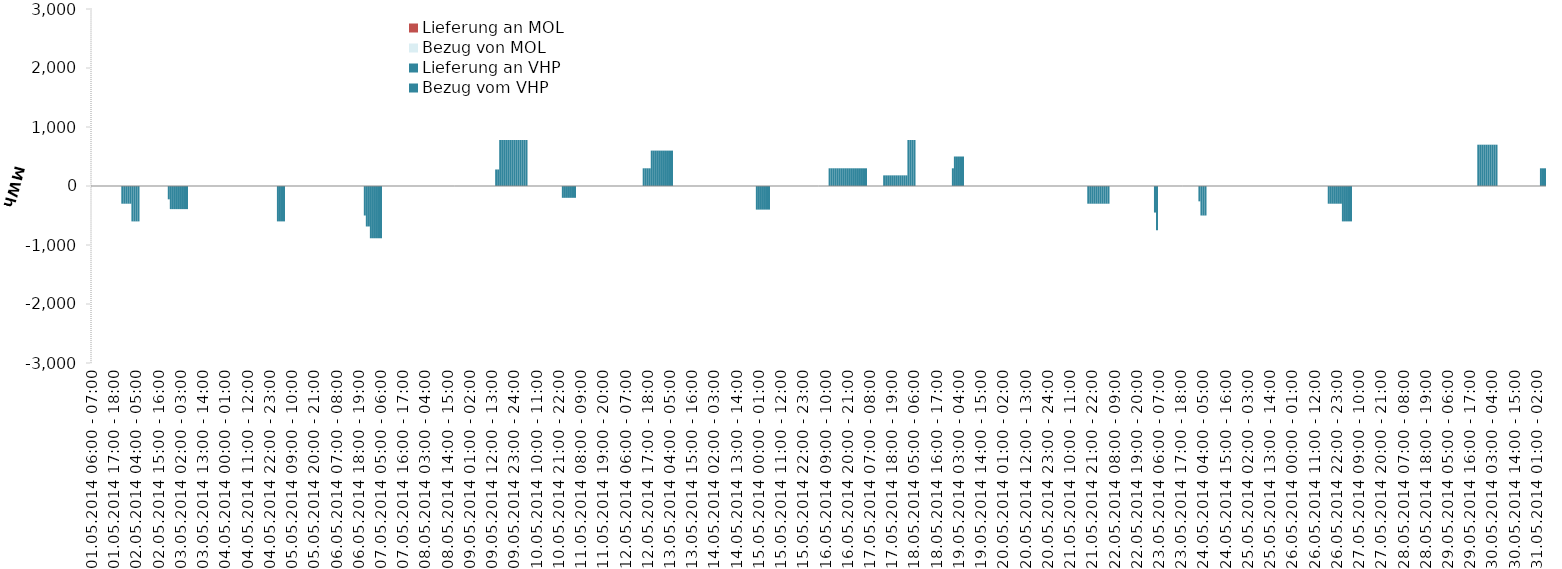
| Category | Bezug vom VHP | Lieferung an VHP | Bezug von MOL | Lieferung an MOL |
|---|---|---|---|---|
| 01.05.2014 06:00 - 07:00 | 0 | 0 | 0 | 0 |
| 01.05.2014 07:00 - 08:00 | 0 | 0 | 0 | 0 |
| 01.05.2014 08:00 - 09:00 | 0 | 0 | 0 | 0 |
| 01.05.2014 09:00 - 10:00 | 0 | 0 | 0 | 0 |
| 01.05.2014 10:00 - 11:00 | 0 | 0 | 0 | 0 |
| 01.05.2014 11:00 - 12:00 | 0 | 0 | 0 | 0 |
| 01.05.2014 12:00 - 13:00 | 0 | 0 | 0 | 0 |
| 01.05.2014 13:00 - 14:00 | 0 | 0 | 0 | 0 |
| 01.05.2014 14:00 - 15:00 | 0 | 0 | 0 | 0 |
| 01.05.2014 15:00 - 16:00 | 0 | 0 | 0 | 0 |
| 01.05.2014 16:00 - 17:00 | 0 | 0 | 0 | 0 |
| 01.05.2014 17:00 - 18:00 | 0 | 0 | 0 | 0 |
| 01.05.2014 18:00 - 19:00 | 0 | 0 | 0 | 0 |
| 01.05.2014 19:00 - 20:00 | 0 | 0 | 0 | 0 |
| 01.05.2014 20:00 - 21:00 | 0 | 0 | 0 | 0 |
| 01.05.2014 21:00 - 22:00 | 0 | -300 | 0 | 0 |
| 01.05.2014 22:00 - 23:00 | 0 | -300 | 0 | 0 |
| 01.05.2014 23:00 - 24:00 | 0 | -300 | 0 | 0 |
| 02.05.2014 00:00 - 01:00 | 0 | -300 | 0 | 0 |
| 02.05.2014 01:00 - 02:00 | 0 | -300 | 0 | 0 |
| 02.05.2014 02:00 - 03:00 | 0 | -600 | 0 | 0 |
| 02.05.2014 03:00 - 04:00 | 0 | -600 | 0 | 0 |
| 02.05.2014 04:00 - 05:00 | 0 | -600 | 0 | 0 |
| 02.05.2014 05:00 - 06:00 | 0 | -600 | 0 | 0 |
| 02.05.2014 06:00 - 07:00 | 0 | 0 | 0 | 0 |
| 02.05.2014 07:00 - 08:00 | 0 | 0 | 0 | 0 |
| 02.05.2014 08:00 - 09:00 | 0 | 0 | 0 | 0 |
| 02.05.2014 09:00 - 10:00 | 0 | 0 | 0 | 0 |
| 02.05.2014 10:00 - 11:00 | 0 | 0 | 0 | 0 |
| 02.05.2014 11:00 - 12:00 | 0 | 0 | 0 | 0 |
| 02.05.2014 12:00 - 13:00 | 0 | 0 | 0 | 0 |
| 02.05.2014 13:00 - 14:00 | 0 | 0 | 0 | 0 |
| 02.05.2014 14:00 - 15:00 | 0 | 0 | 0 | 0 |
| 02.05.2014 15:00 - 16:00 | 0 | 0 | 0 | 0 |
| 02.05.2014 16:00 - 17:00 | 0 | 0 | 0 | 0 |
| 02.05.2014 17:00 - 18:00 | 0 | 0 | 0 | 0 |
| 02.05.2014 18:00 - 19:00 | 0 | 0 | 0 | 0 |
| 02.05.2014 19:00 - 20:00 | 0 | 0 | 0 | 0 |
| 02.05.2014 20:00 - 21:00 | 0 | -226 | 0 | 0 |
| 02.05.2014 21:00 - 22:00 | 0 | -392 | 0 | 0 |
| 02.05.2014 22:00 - 23:00 | 0 | -392 | 0 | 0 |
| 02.05.2014 23:00 - 24:00 | 0 | -392 | 0 | 0 |
| 03.05.2014 00:00 - 01:00 | 0 | -392 | 0 | 0 |
| 03.05.2014 01:00 - 02:00 | 0 | -392 | 0 | 0 |
| 03.05.2014 02:00 - 03:00 | 0 | -392 | 0 | 0 |
| 03.05.2014 03:00 - 04:00 | 0 | -392 | 0 | 0 |
| 03.05.2014 04:00 - 05:00 | 0 | -392 | 0 | 0 |
| 03.05.2014 05:00 - 06:00 | 0 | -392 | 0 | 0 |
| 03.05.2014 06:00 - 07:00 | 0 | 0 | 0 | 0 |
| 03.05.2014 07:00 - 08:00 | 0 | 0 | 0 | 0 |
| 03.05.2014 08:00 - 09:00 | 0 | 0 | 0 | 0 |
| 03.05.2014 09:00 - 10:00 | 0 | 0 | 0 | 0 |
| 03.05.2014 10:00 - 11:00 | 0 | 0 | 0 | 0 |
| 03.05.2014 11:00 - 12:00 | 0 | 0 | 0 | 0 |
| 03.05.2014 12:00 - 13:00 | 0 | 0 | 0 | 0 |
| 03.05.2014 13:00 - 14:00 | 0 | 0 | 0 | 0 |
| 03.05.2014 14:00 - 15:00 | 0 | 0 | 0 | 0 |
| 03.05.2014 15:00 - 16:00 | 0 | 0 | 0 | 0 |
| 03.05.2014 16:00 - 17:00 | 0 | 0 | 0 | 0 |
| 03.05.2014 17:00 - 18:00 | 0 | 0 | 0 | 0 |
| 03.05.2014 18:00 - 19:00 | 0 | 0 | 0 | 0 |
| 03.05.2014 19:00 - 20:00 | 0 | 0 | 0 | 0 |
| 03.05.2014 20:00 - 21:00 | 0 | 0 | 0 | 0 |
| 03.05.2014 21:00 - 22:00 | 0 | 0 | 0 | 0 |
| 03.05.2014 22:00 - 23:00 | 0 | 0 | 0 | 0 |
| 03.05.2014 23:00 - 24:00 | 0 | 0 | 0 | 0 |
| 04.05.2014 00:00 - 01:00 | 0 | 0 | 0 | 0 |
| 04.05.2014 01:00 - 02:00 | 0 | 0 | 0 | 0 |
| 04.05.2014 02:00 - 03:00 | 0 | 0 | 0 | 0 |
| 04.05.2014 03:00 - 04:00 | 0 | 0 | 0 | 0 |
| 04.05.2014 04:00 - 05:00 | 0 | 0 | 0 | 0 |
| 04.05.2014 05:00 - 06:00 | 0 | 0 | 0 | 0 |
| 04.05.2014 06:00 - 07:00 | 0 | 0 | 0 | 0 |
| 04.05.2014 07:00 - 08:00 | 0 | 0 | 0 | 0 |
| 04.05.2014 08:00 - 09:00 | 0 | 0 | 0 | 0 |
| 04.05.2014 09:00 - 10:00 | 0 | 0 | 0 | 0 |
| 04.05.2014 10:00 - 11:00 | 0 | 0 | 0 | 0 |
| 04.05.2014 11:00 - 12:00 | 0 | 0 | 0 | 0 |
| 04.05.2014 12:00 - 13:00 | 0 | 0 | 0 | 0 |
| 04.05.2014 13:00 - 14:00 | 0 | 0 | 0 | 0 |
| 04.05.2014 14:00 - 15:00 | 0 | 0 | 0 | 0 |
| 04.05.2014 15:00 - 16:00 | 0 | 0 | 0 | 0 |
| 04.05.2014 16:00 - 17:00 | 0 | 0 | 0 | 0 |
| 04.05.2014 17:00 - 18:00 | 0 | 0 | 0 | 0 |
| 04.05.2014 18:00 - 19:00 | 0 | 0 | 0 | 0 |
| 04.05.2014 19:00 - 20:00 | 0 | 0 | 0 | 0 |
| 04.05.2014 20:00 - 21:00 | 0 | 0 | 0 | 0 |
| 04.05.2014 21:00 - 22:00 | 0 | 0 | 0 | 0 |
| 04.05.2014 22:00 - 23:00 | 0 | 0 | 0 | 0 |
| 04.05.2014 23:00 - 24:00 | 0 | 0 | 0 | 0 |
| 05.05.2014 00:00 - 01:00 | 0 | 0 | 0 | 0 |
| 05.05.2014 01:00 - 02:00 | 0 | 0 | 0 | 0 |
| 05.05.2014 02:00 - 03:00 | 0 | -600 | 0 | 0 |
| 05.05.2014 03:00 - 04:00 | 0 | -600 | 0 | 0 |
| 05.05.2014 04:00 - 05:00 | 0 | -600 | 0 | 0 |
| 05.05.2014 05:00 - 06:00 | 0 | -600 | 0 | 0 |
| 05.05.2014 06:00 - 07:00 | 0 | 0 | 0 | 0 |
| 05.05.2014 07:00 - 08:00 | 0 | 0 | 0 | 0 |
| 05.05.2014 08:00 - 09:00 | 0 | 0 | 0 | 0 |
| 05.05.2014 09:00 - 10:00 | 0 | 0 | 0 | 0 |
| 05.05.2014 10:00 - 11:00 | 0 | 0 | 0 | 0 |
| 05.05.2014 11:00 - 12:00 | 0 | 0 | 0 | 0 |
| 05.05.2014 12:00 - 13:00 | 0 | 0 | 0 | 0 |
| 05.05.2014 13:00 - 14:00 | 0 | 0 | 0 | 0 |
| 05.05.2014 14:00 - 15:00 | 0 | 0 | 0 | 0 |
| 05.05.2014 15:00 - 16:00 | 0 | 0 | 0 | 0 |
| 05.05.2014 16:00 - 17:00 | 0 | 0 | 0 | 0 |
| 05.05.2014 17:00 - 18:00 | 0 | 0 | 0 | 0 |
| 05.05.2014 18:00 - 19:00 | 0 | 0 | 0 | 0 |
| 05.05.2014 19:00 - 20:00 | 0 | 0 | 0 | 0 |
| 05.05.2014 20:00 - 21:00 | 0 | 0 | 0 | 0 |
| 05.05.2014 21:00 - 22:00 | 0 | 0 | 0 | 0 |
| 05.05.2014 22:00 - 23:00 | 0 | 0 | 0 | 0 |
| 05.05.2014 23:00 - 24:00 | 0 | 0 | 0 | 0 |
| 06.05.2014 00:00 - 01:00 | 0 | 0 | 0 | 0 |
| 06.05.2014 01:00 - 02:00 | 0 | 0 | 0 | 0 |
| 06.05.2014 02:00 - 03:00 | 0 | 0 | 0 | 0 |
| 06.05.2014 03:00 - 04:00 | 0 | 0 | 0 | 0 |
| 06.05.2014 04:00 - 05:00 | 0 | 0 | 0 | 0 |
| 06.05.2014 05:00 - 06:00 | 0 | 0 | 0 | 0 |
| 06.05.2014 06:00 - 07:00 | 0 | 0 | 0 | 0 |
| 06.05.2014 07:00 - 08:00 | 0 | 0 | 0 | 0 |
| 06.05.2014 08:00 - 09:00 | 0 | 0 | 0 | 0 |
| 06.05.2014 09:00 - 10:00 | 0 | 0 | 0 | 0 |
| 06.05.2014 10:00 - 11:00 | 0 | 0 | 0 | 0 |
| 06.05.2014 11:00 - 12:00 | 0 | 0 | 0 | 0 |
| 06.05.2014 12:00 - 13:00 | 0 | 0 | 0 | 0 |
| 06.05.2014 13:00 - 14:00 | 0 | 0 | 0 | 0 |
| 06.05.2014 14:00 - 15:00 | 0 | 0 | 0 | 0 |
| 06.05.2014 15:00 - 16:00 | 0 | 0 | 0 | 0 |
| 06.05.2014 16:00 - 17:00 | 0 | 0 | 0 | 0 |
| 06.05.2014 17:00 - 18:00 | 0 | 0 | 0 | 0 |
| 06.05.2014 18:00 - 19:00 | 0 | 0 | 0 | 0 |
| 06.05.2014 19:00 - 20:00 | 0 | 0 | 0 | 0 |
| 06.05.2014 20:00 - 21:00 | 0 | 0 | 0 | 0 |
| 06.05.2014 21:00 - 22:00 | 0 | -500 | 0 | 0 |
| 06.05.2014 22:00 - 23:00 | 0 | -686 | 0 | 0 |
| 06.05.2014 23:00 - 24:00 | 0 | -686 | 0 | 0 |
| 07.05.2014 00:00 - 01:00 | 0 | -886 | 0 | 0 |
| 07.05.2014 01:00 - 02:00 | 0 | -886 | 0 | 0 |
| 07.05.2014 02:00 - 03:00 | 0 | -886 | 0 | 0 |
| 07.05.2014 03:00 - 04:00 | 0 | -886 | 0 | 0 |
| 07.05.2014 04:00 - 05:00 | 0 | -886 | 0 | 0 |
| 07.05.2014 05:00 - 06:00 | 0 | -886 | 0 | 0 |
| 07.05.2014 06:00 - 07:00 | 0 | 0 | 0 | 0 |
| 07.05.2014 07:00 - 08:00 | 0 | 0 | 0 | 0 |
| 07.05.2014 08:00 - 09:00 | 0 | 0 | 0 | 0 |
| 07.05.2014 09:00 - 10:00 | 0 | 0 | 0 | 0 |
| 07.05.2014 10:00 - 11:00 | 0 | 0 | 0 | 0 |
| 07.05.2014 11:00 - 12:00 | 0 | 0 | 0 | 0 |
| 07.05.2014 12:00 - 13:00 | 0 | 0 | 0 | 0 |
| 07.05.2014 13:00 - 14:00 | 0 | 0 | 0 | 0 |
| 07.05.2014 14:00 - 15:00 | 0 | 0 | 0 | 0 |
| 07.05.2014 15:00 - 16:00 | 0 | 0 | 0 | 0 |
| 07.05.2014 16:00 - 17:00 | 0 | 0 | 0 | 0 |
| 07.05.2014 17:00 - 18:00 | 0 | 0 | 0 | 0 |
| 07.05.2014 18:00 - 19:00 | 0 | 0 | 0 | 0 |
| 07.05.2014 19:00 - 20:00 | 0 | 0 | 0 | 0 |
| 07.05.2014 20:00 - 21:00 | 0 | 0 | 0 | 0 |
| 07.05.2014 21:00 - 22:00 | 0 | 0 | 0 | 0 |
| 07.05.2014 22:00 - 23:00 | 0 | 0 | 0 | 0 |
| 07.05.2014 23:00 - 24:00 | 0 | 0 | 0 | 0 |
| 08.05.2014 00:00 - 01:00 | 0 | 0 | 0 | 0 |
| 08.05.2014 01:00 - 02:00 | 0 | 0 | 0 | 0 |
| 08.05.2014 02:00 - 03:00 | 0 | 0 | 0 | 0 |
| 08.05.2014 03:00 - 04:00 | 0 | 0 | 0 | 0 |
| 08.05.2014 04:00 - 05:00 | 0 | 0 | 0 | 0 |
| 08.05.2014 05:00 - 06:00 | 0 | 0 | 0 | 0 |
| 08.05.2014 06:00 - 07:00 | 0 | 0 | 0 | 0 |
| 08.05.2014 07:00 - 08:00 | 0 | 0 | 0 | 0 |
| 08.05.2014 08:00 - 09:00 | 0 | 0 | 0 | 0 |
| 08.05.2014 09:00 - 10:00 | 0 | 0 | 0 | 0 |
| 08.05.2014 10:00 - 11:00 | 0 | 0 | 0 | 0 |
| 08.05.2014 11:00 - 12:00 | 0 | 0 | 0 | 0 |
| 08.05.2014 12:00 - 13:00 | 0 | 0 | 0 | 0 |
| 08.05.2014 13:00 - 14:00 | 0 | 0 | 0 | 0 |
| 08.05.2014 14:00 - 15:00 | 0 | 0 | 0 | 0 |
| 08.05.2014 15:00 - 16:00 | 0 | 0 | 0 | 0 |
| 08.05.2014 16:00 - 17:00 | 0 | 0 | 0 | 0 |
| 08.05.2014 17:00 - 18:00 | 0 | 0 | 0 | 0 |
| 08.05.2014 18:00 - 19:00 | 0 | 0 | 0 | 0 |
| 08.05.2014 19:00 - 20:00 | 0 | 0 | 0 | 0 |
| 08.05.2014 20:00 - 21:00 | 0 | 0 | 0 | 0 |
| 08.05.2014 21:00 - 22:00 | 0 | 0 | 0 | 0 |
| 08.05.2014 22:00 - 23:00 | 0 | 0 | 0 | 0 |
| 08.05.2014 23:00 - 24:00 | 0 | 0 | 0 | 0 |
| 09.05.2014 00:00 - 01:00 | 0 | 0 | 0 | 0 |
| 09.05.2014 01:00 - 02:00 | 0 | 0 | 0 | 0 |
| 09.05.2014 02:00 - 03:00 | 0 | 0 | 0 | 0 |
| 09.05.2014 03:00 - 04:00 | 0 | 0 | 0 | 0 |
| 09.05.2014 04:00 - 05:00 | 0 | 0 | 0 | 0 |
| 09.05.2014 05:00 - 06:00 | 0 | 0 | 0 | 0 |
| 09.05.2014 06:00 - 07:00 | 0 | 0 | 0 | 0 |
| 09.05.2014 07:00 - 08:00 | 0 | 0 | 0 | 0 |
| 09.05.2014 08:00 - 09:00 | 0 | 0 | 0 | 0 |
| 09.05.2014 09:00 - 10:00 | 0 | 0 | 0 | 0 |
| 09.05.2014 10:00 - 11:00 | 0 | 0 | 0 | 0 |
| 09.05.2014 11:00 - 12:00 | 0 | 0 | 0 | 0 |
| 09.05.2014 12:00 - 13:00 | 0 | 0 | 0 | 0 |
| 09.05.2014 13:00 - 14:00 | 0 | 0 | 0 | 0 |
| 09.05.2014 14:00 - 15:00 | 280 | 0 | 0 | 0 |
| 09.05.2014 15:00 - 16:00 | 280 | 0 | 0 | 0 |
| 09.05.2014 16:00 - 17:00 | 780 | 0 | 0 | 0 |
| 09.05.2014 17:00 - 18:00 | 780 | 0 | 0 | 0 |
| 09.05.2014 18:00 - 19:00 | 780 | 0 | 0 | 0 |
| 09.05.2014 19:00 - 20:00 | 780 | 0 | 0 | 0 |
| 09.05.2014 20:00 - 21:00 | 780 | 0 | 0 | 0 |
| 09.05.2014 21:00 - 22:00 | 780 | 0 | 0 | 0 |
| 09.05.2014 22:00 - 23:00 | 780 | 0 | 0 | 0 |
| 09.05.2014 23:00 - 24:00 | 780 | 0 | 0 | 0 |
| 10.05.2014 00:00 - 01:00 | 780 | 0 | 0 | 0 |
| 10.05.2014 01:00 - 02:00 | 780 | 0 | 0 | 0 |
| 10.05.2014 02:00 - 03:00 | 780 | 0 | 0 | 0 |
| 10.05.2014 03:00 - 04:00 | 780 | 0 | 0 | 0 |
| 10.05.2014 04:00 - 05:00 | 780 | 0 | 0 | 0 |
| 10.05.2014 05:00 - 06:00 | 780 | 0 | 0 | 0 |
| 10.05.2014 06:00 - 07:00 | 0 | 0 | 0 | 0 |
| 10.05.2014 07:00 - 08:00 | 0 | 0 | 0 | 0 |
| 10.05.2014 08:00 - 09:00 | 0 | 0 | 0 | 0 |
| 10.05.2014 09:00 - 10:00 | 0 | 0 | 0 | 0 |
| 10.05.2014 10:00 - 11:00 | 0 | 0 | 0 | 0 |
| 10.05.2014 11:00 - 12:00 | 0 | 0 | 0 | 0 |
| 10.05.2014 12:00 - 13:00 | 0 | 0 | 0 | 0 |
| 10.05.2014 13:00 - 14:00 | 0 | 0 | 0 | 0 |
| 10.05.2014 14:00 - 15:00 | 0 | 0 | 0 | 0 |
| 10.05.2014 15:00 - 16:00 | 0 | 0 | 0 | 0 |
| 10.05.2014 16:00 - 17:00 | 0 | 0 | 0 | 0 |
| 10.05.2014 17:00 - 18:00 | 0 | 0 | 0 | 0 |
| 10.05.2014 18:00 - 19:00 | 0 | 0 | 0 | 0 |
| 10.05.2014 19:00 - 20:00 | 0 | 0 | 0 | 0 |
| 10.05.2014 20:00 - 21:00 | 0 | 0 | 0 | 0 |
| 10.05.2014 21:00 - 22:00 | 0 | 0 | 0 | 0 |
| 10.05.2014 22:00 - 23:00 | 0 | 0 | 0 | 0 |
| 10.05.2014 23:00 - 24:00 | 0 | -200 | 0 | 0 |
| 11.05.2014 00:00 - 01:00 | 0 | -200 | 0 | 0 |
| 11.05.2014 01:00 - 02:00 | 0 | -200 | 0 | 0 |
| 11.05.2014 02:00 - 03:00 | 0 | -200 | 0 | 0 |
| 11.05.2014 03:00 - 04:00 | 0 | -200 | 0 | 0 |
| 11.05.2014 04:00 - 05:00 | 0 | -200 | 0 | 0 |
| 11.05.2014 05:00 - 06:00 | 0 | -200 | 0 | 0 |
| 11.05.2014 06:00 - 07:00 | 0 | 0 | 0 | 0 |
| 11.05.2014 07:00 - 08:00 | 0 | 0 | 0 | 0 |
| 11.05.2014 08:00 - 09:00 | 0 | 0 | 0 | 0 |
| 11.05.2014 09:00 - 10:00 | 0 | 0 | 0 | 0 |
| 11.05.2014 10:00 - 11:00 | 0 | 0 | 0 | 0 |
| 11.05.2014 11:00 - 12:00 | 0 | 0 | 0 | 0 |
| 11.05.2014 12:00 - 13:00 | 0 | 0 | 0 | 0 |
| 11.05.2014 13:00 - 14:00 | 0 | 0 | 0 | 0 |
| 11.05.2014 14:00 - 15:00 | 0 | 0 | 0 | 0 |
| 11.05.2014 15:00 - 16:00 | 0 | 0 | 0 | 0 |
| 11.05.2014 16:00 - 17:00 | 0 | 0 | 0 | 0 |
| 11.05.2014 17:00 - 18:00 | 0 | 0 | 0 | 0 |
| 11.05.2014 18:00 - 19:00 | 0 | 0 | 0 | 0 |
| 11.05.2014 19:00 - 20:00 | 0 | 0 | 0 | 0 |
| 11.05.2014 20:00 - 21:00 | 0 | 0 | 0 | 0 |
| 11.05.2014 21:00 - 22:00 | 0 | 0 | 0 | 0 |
| 11.05.2014 22:00 - 23:00 | 0 | 0 | 0 | 0 |
| 11.05.2014 23:00 - 24:00 | 0 | 0 | 0 | 0 |
| 12.05.2014 00:00 - 01:00 | 0 | 0 | 0 | 0 |
| 12.05.2014 01:00 - 02:00 | 0 | 0 | 0 | 0 |
| 12.05.2014 02:00 - 03:00 | 0 | 0 | 0 | 0 |
| 12.05.2014 03:00 - 04:00 | 0 | 0 | 0 | 0 |
| 12.05.2014 04:00 - 05:00 | 0 | 0 | 0 | 0 |
| 12.05.2014 05:00 - 06:00 | 0 | 0 | 0 | 0 |
| 12.05.2014 06:00 - 07:00 | 0 | 0 | 0 | 0 |
| 12.05.2014 07:00 - 08:00 | 0 | 0 | 0 | 0 |
| 12.05.2014 08:00 - 09:00 | 0 | 0 | 0 | 0 |
| 12.05.2014 09:00 - 10:00 | 0 | 0 | 0 | 0 |
| 12.05.2014 10:00 - 11:00 | 0 | 0 | 0 | 0 |
| 12.05.2014 11:00 - 12:00 | 0 | 0 | 0 | 0 |
| 12.05.2014 12:00 - 13:00 | 0 | 0 | 0 | 0 |
| 12.05.2014 13:00 - 14:00 | 0 | 0 | 0 | 0 |
| 12.05.2014 14:00 - 15:00 | 0 | 0 | 0 | 0 |
| 12.05.2014 15:00 - 16:00 | 300 | 0 | 0 | 0 |
| 12.05.2014 16:00 - 17:00 | 300 | 0 | 0 | 0 |
| 12.05.2014 17:00 - 18:00 | 300 | 0 | 0 | 0 |
| 12.05.2014 18:00 - 19:00 | 300 | 0 | 0 | 0 |
| 12.05.2014 19:00 - 20:00 | 600 | 0 | 0 | 0 |
| 12.05.2014 20:00 - 21:00 | 600 | 0 | 0 | 0 |
| 12.05.2014 21:00 - 22:00 | 600 | 0 | 0 | 0 |
| 12.05.2014 22:00 - 23:00 | 600 | 0 | 0 | 0 |
| 12.05.2014 23:00 - 24:00 | 600 | 0 | 0 | 0 |
| 13.05.2014 00:00 - 01:00 | 600 | 0 | 0 | 0 |
| 13.05.2014 01:00 - 02:00 | 600 | 0 | 0 | 0 |
| 13.05.2014 02:00 - 03:00 | 600 | 0 | 0 | 0 |
| 13.05.2014 03:00 - 04:00 | 600 | 0 | 0 | 0 |
| 13.05.2014 04:00 - 05:00 | 600 | 0 | 0 | 0 |
| 13.05.2014 05:00 - 06:00 | 600 | 0 | 0 | 0 |
| 13.05.2014 06:00 - 07:00 | 0 | 0 | 0 | 0 |
| 13.05.2014 07:00 - 08:00 | 0 | 0 | 0 | 0 |
| 13.05.2014 08:00 - 09:00 | 0 | 0 | 0 | 0 |
| 13.05.2014 09:00 - 10:00 | 0 | 0 | 0 | 0 |
| 13.05.2014 10:00 - 11:00 | 0 | 0 | 0 | 0 |
| 13.05.2014 11:00 - 12:00 | 0 | 0 | 0 | 0 |
| 13.05.2014 12:00 - 13:00 | 0 | 0 | 0 | 0 |
| 13.05.2014 13:00 - 14:00 | 0 | 0 | 0 | 0 |
| 13.05.2014 14:00 - 15:00 | 0 | 0 | 0 | 0 |
| 13.05.2014 15:00 - 16:00 | 0 | 0 | 0 | 0 |
| 13.05.2014 16:00 - 17:00 | 0 | 0 | 0 | 0 |
| 13.05.2014 17:00 - 18:00 | 0 | 0 | 0 | 0 |
| 13.05.2014 18:00 - 19:00 | 0 | 0 | 0 | 0 |
| 13.05.2014 19:00 - 20:00 | 0 | 0 | 0 | 0 |
| 13.05.2014 20:00 - 21:00 | 0 | 0 | 0 | 0 |
| 13.05.2014 21:00 - 22:00 | 0 | 0 | 0 | 0 |
| 13.05.2014 22:00 - 23:00 | 0 | 0 | 0 | 0 |
| 13.05.2014 23:00 - 24:00 | 0 | 0 | 0 | 0 |
| 14.05.2014 00:00 - 01:00 | 0 | 0 | 0 | 0 |
| 14.05.2014 01:00 - 02:00 | 0 | 0 | 0 | 0 |
| 14.05.2014 02:00 - 03:00 | 0 | 0 | 0 | 0 |
| 14.05.2014 03:00 - 04:00 | 0 | 0 | 0 | 0 |
| 14.05.2014 04:00 - 05:00 | 0 | 0 | 0 | 0 |
| 14.05.2014 05:00 - 06:00 | 0 | 0 | 0 | 0 |
| 14.05.2014 06:00 - 07:00 | 0 | 0 | 0 | 0 |
| 14.05.2014 07:00 - 08:00 | 0 | 0 | 0 | 0 |
| 14.05.2014 08:00 - 09:00 | 0 | 0 | 0 | 0 |
| 14.05.2014 09:00 - 10:00 | 0 | 0 | 0 | 0 |
| 14.05.2014 10:00 - 11:00 | 0 | 0 | 0 | 0 |
| 14.05.2014 11:00 - 12:00 | 0 | 0 | 0 | 0 |
| 14.05.2014 12:00 - 13:00 | 0 | 0 | 0 | 0 |
| 14.05.2014 13:00 - 14:00 | 0 | 0 | 0 | 0 |
| 14.05.2014 14:00 - 15:00 | 0 | 0 | 0 | 0 |
| 14.05.2014 15:00 - 16:00 | 0 | 0 | 0 | 0 |
| 14.05.2014 16:00 - 17:00 | 0 | 0 | 0 | 0 |
| 14.05.2014 17:00 - 18:00 | 0 | 0 | 0 | 0 |
| 14.05.2014 18:00 - 19:00 | 0 | 0 | 0 | 0 |
| 14.05.2014 19:00 - 20:00 | 0 | 0 | 0 | 0 |
| 14.05.2014 20:00 - 21:00 | 0 | 0 | 0 | 0 |
| 14.05.2014 21:00 - 22:00 | 0 | 0 | 0 | 0 |
| 14.05.2014 22:00 - 23:00 | 0 | 0 | 0 | 0 |
| 14.05.2014 23:00 - 24:00 | 0 | -400 | 0 | 0 |
| 15.05.2014 00:00 - 01:00 | 0 | -400 | 0 | 0 |
| 15.05.2014 01:00 - 02:00 | 0 | -400 | 0 | 0 |
| 15.05.2014 02:00 - 03:00 | 0 | -400 | 0 | 0 |
| 15.05.2014 03:00 - 04:00 | 0 | -400 | 0 | 0 |
| 15.05.2014 04:00 - 05:00 | 0 | -400 | 0 | 0 |
| 15.05.2014 05:00 - 06:00 | 0 | -400 | 0 | 0 |
| 15.05.2014 06:00 - 07:00 | 0 | 0 | 0 | 0 |
| 15.05.2014 07:00 - 08:00 | 0 | 0 | 0 | 0 |
| 15.05.2014 08:00 - 09:00 | 0 | 0 | 0 | 0 |
| 15.05.2014 09:00 - 10:00 | 0 | 0 | 0 | 0 |
| 15.05.2014 10:00 - 11:00 | 0 | 0 | 0 | 0 |
| 15.05.2014 11:00 - 12:00 | 0 | 0 | 0 | 0 |
| 15.05.2014 12:00 - 13:00 | 0 | 0 | 0 | 0 |
| 15.05.2014 13:00 - 14:00 | 0 | 0 | 0 | 0 |
| 15.05.2014 14:00 - 15:00 | 0 | 0 | 0 | 0 |
| 15.05.2014 15:00 - 16:00 | 0 | 0 | 0 | 0 |
| 15.05.2014 16:00 - 17:00 | 0 | 0 | 0 | 0 |
| 15.05.2014 17:00 - 18:00 | 0 | 0 | 0 | 0 |
| 15.05.2014 18:00 - 19:00 | 0 | 0 | 0 | 0 |
| 15.05.2014 19:00 - 20:00 | 0 | 0 | 0 | 0 |
| 15.05.2014 20:00 - 21:00 | 0 | 0 | 0 | 0 |
| 15.05.2014 21:00 - 22:00 | 0 | 0 | 0 | 0 |
| 15.05.2014 22:00 - 23:00 | 0 | 0 | 0 | 0 |
| 15.05.2014 23:00 - 24:00 | 0 | 0 | 0 | 0 |
| 16.05.2014 00:00 - 01:00 | 0 | 0 | 0 | 0 |
| 16.05.2014 01:00 - 02:00 | 0 | 0 | 0 | 0 |
| 16.05.2014 02:00 - 03:00 | 0 | 0 | 0 | 0 |
| 16.05.2014 03:00 - 04:00 | 0 | 0 | 0 | 0 |
| 16.05.2014 04:00 - 05:00 | 0 | 0 | 0 | 0 |
| 16.05.2014 05:00 - 06:00 | 0 | 0 | 0 | 0 |
| 16.05.2014 06:00 - 07:00 | 0 | 0 | 0 | 0 |
| 16.05.2014 07:00 - 08:00 | 0 | 0 | 0 | 0 |
| 16.05.2014 08:00 - 09:00 | 0 | 0 | 0 | 0 |
| 16.05.2014 09:00 - 10:00 | 0 | 0 | 0 | 0 |
| 16.05.2014 10:00 - 11:00 | 0 | 0 | 0 | 0 |
| 16.05.2014 11:00 - 12:00 | 300 | 0 | 0 | 0 |
| 16.05.2014 12:00 - 13:00 | 300 | 0 | 0 | 0 |
| 16.05.2014 13:00 - 14:00 | 300 | 0 | 0 | 0 |
| 16.05.2014 14:00 - 15:00 | 300 | 0 | 0 | 0 |
| 16.05.2014 15:00 - 16:00 | 300 | 0 | 0 | 0 |
| 16.05.2014 16:00 - 17:00 | 300 | 0 | 0 | 0 |
| 16.05.2014 17:00 - 18:00 | 300 | 0 | 0 | 0 |
| 16.05.2014 18:00 - 19:00 | 300 | 0 | 0 | 0 |
| 16.05.2014 19:00 - 20:00 | 300 | 0 | 0 | 0 |
| 16.05.2014 20:00 - 21:00 | 300 | 0 | 0 | 0 |
| 16.05.2014 21:00 - 22:00 | 300 | 0 | 0 | 0 |
| 16.05.2014 22:00 - 23:00 | 300 | 0 | 0 | 0 |
| 16.05.2014 23:00 - 24:00 | 300 | 0 | 0 | 0 |
| 17.05.2014 00:00 - 01:00 | 300 | 0 | 0 | 0 |
| 17.05.2014 01:00 - 02:00 | 300 | 0 | 0 | 0 |
| 17.05.2014 02:00 - 03:00 | 300 | 0 | 0 | 0 |
| 17.05.2014 03:00 - 04:00 | 300 | 0 | 0 | 0 |
| 17.05.2014 04:00 - 05:00 | 300 | 0 | 0 | 0 |
| 17.05.2014 05:00 - 06:00 | 300 | 0 | 0 | 0 |
| 17.05.2014 06:00 - 07:00 | 0 | 0 | 0 | 0 |
| 17.05.2014 07:00 - 08:00 | 0 | 0 | 0 | 0 |
| 17.05.2014 08:00 - 09:00 | 0 | 0 | 0 | 0 |
| 17.05.2014 09:00 - 10:00 | 0 | 0 | 0 | 0 |
| 17.05.2014 10:00 - 11:00 | 0 | 0 | 0 | 0 |
| 17.05.2014 11:00 - 12:00 | 0 | 0 | 0 | 0 |
| 17.05.2014 12:00 - 13:00 | 0 | 0 | 0 | 0 |
| 17.05.2014 13:00 - 14:00 | 0 | 0 | 0 | 0 |
| 17.05.2014 14:00 - 15:00 | 180 | 0 | 0 | 0 |
| 17.05.2014 15:00 - 16:00 | 180 | 0 | 0 | 0 |
| 17.05.2014 16:00 - 17:00 | 180 | 0 | 0 | 0 |
| 17.05.2014 17:00 - 18:00 | 180 | 0 | 0 | 0 |
| 17.05.2014 18:00 - 19:00 | 180 | 0 | 0 | 0 |
| 17.05.2014 19:00 - 20:00 | 180 | 0 | 0 | 0 |
| 17.05.2014 20:00 - 21:00 | 180 | 0 | 0 | 0 |
| 17.05.2014 21:00 - 22:00 | 180 | 0 | 0 | 0 |
| 17.05.2014 22:00 - 23:00 | 180 | 0 | 0 | 0 |
| 17.05.2014 23:00 - 24:00 | 180 | 0 | 0 | 0 |
| 18.05.2014 00:00 - 01:00 | 180 | 0 | 0 | 0 |
| 18.05.2014 01:00 - 02:00 | 180 | 0 | 0 | 0 |
| 18.05.2014 02:00 - 03:00 | 780 | 0 | 0 | 0 |
| 18.05.2014 03:00 - 04:00 | 780 | 0 | 0 | 0 |
| 18.05.2014 04:00 - 05:00 | 780 | 0 | 0 | 0 |
| 18.05.2014 05:00 - 06:00 | 780 | 0 | 0 | 0 |
| 18.05.2014 06:00 - 07:00 | 0 | 0 | 0 | 0 |
| 18.05.2014 07:00 - 08:00 | 0 | 0 | 0 | 0 |
| 18.05.2014 08:00 - 09:00 | 0 | 0 | 0 | 0 |
| 18.05.2014 09:00 - 10:00 | 0 | 0 | 0 | 0 |
| 18.05.2014 10:00 - 11:00 | 0 | 0 | 0 | 0 |
| 18.05.2014 11:00 - 12:00 | 0 | 0 | 0 | 0 |
| 18.05.2014 12:00 - 13:00 | 0 | 0 | 0 | 0 |
| 18.05.2014 13:00 - 14:00 | 0 | 0 | 0 | 0 |
| 18.05.2014 14:00 - 15:00 | 0 | 0 | 0 | 0 |
| 18.05.2014 15:00 - 16:00 | 0 | 0 | 0 | 0 |
| 18.05.2014 16:00 - 17:00 | 0 | 0 | 0 | 0 |
| 18.05.2014 17:00 - 18:00 | 0 | 0 | 0 | 0 |
| 18.05.2014 18:00 - 19:00 | 0 | 0 | 0 | 0 |
| 18.05.2014 19:00 - 20:00 | 0 | 0 | 0 | 0 |
| 18.05.2014 20:00 - 21:00 | 0 | 0 | 0 | 0 |
| 18.05.2014 21:00 - 22:00 | 0 | 0 | 0 | 0 |
| 18.05.2014 22:00 - 23:00 | 0 | 0 | 0 | 0 |
| 18.05.2014 23:00 - 24:00 | 0 | 0 | 0 | 0 |
| 19.05.2014 00:00 - 01:00 | 300 | 0 | 0 | 0 |
| 19.05.2014 01:00 - 02:00 | 500 | 0 | 0 | 0 |
| 19.05.2014 02:00 - 03:00 | 500 | 0 | 0 | 0 |
| 19.05.2014 03:00 - 04:00 | 500 | 0 | 0 | 0 |
| 19.05.2014 04:00 - 05:00 | 500 | 0 | 0 | 0 |
| 19.05.2014 05:00 - 06:00 | 500 | 0 | 0 | 0 |
| 19.05.2014 06:00 - 07:00 | 0 | 0 | 0 | 0 |
| 19.05.2014 07:00 - 08:00 | 0 | 0 | 0 | 0 |
| 19.05.2014 08:00 - 09:00 | 0 | 0 | 0 | 0 |
| 19.05.2014 09:00 - 10:00 | 0 | 0 | 0 | 0 |
| 19.05.2014 10:00 - 11:00 | 0 | 0 | 0 | 0 |
| 19.05.2014 11:00 - 12:00 | 0 | 0 | 0 | 0 |
| 19.05.2014 12:00 - 13:00 | 0 | 0 | 0 | 0 |
| 19.05.2014 13:00 - 14:00 | 0 | 0 | 0 | 0 |
| 19.05.2014 14:00 - 15:00 | 0 | 0 | 0 | 0 |
| 19.05.2014 15:00 - 16:00 | 0 | 0 | 0 | 0 |
| 19.05.2014 16:00 - 17:00 | 0 | 0 | 0 | 0 |
| 19.05.2014 17:00 - 18:00 | 0 | 0 | 0 | 0 |
| 19.05.2014 18:00 - 19:00 | 0 | 0 | 0 | 0 |
| 19.05.2014 19:00 - 20:00 | 0 | 0 | 0 | 0 |
| 19.05.2014 20:00 - 21:00 | 0 | 0 | 0 | 0 |
| 19.05.2014 21:00 - 22:00 | 0 | 0 | 0 | 0 |
| 19.05.2014 22:00 - 23:00 | 0 | 0 | 0 | 0 |
| 19.05.2014 23:00 - 24:00 | 0 | 0 | 0 | 0 |
| 20.05.2014 00:00 - 01:00 | 0 | 0 | 0 | 0 |
| 20.05.2014 01:00 - 02:00 | 0 | 0 | 0 | 0 |
| 20.05.2014 02:00 - 03:00 | 0 | 0 | 0 | 0 |
| 20.05.2014 03:00 - 04:00 | 0 | 0 | 0 | 0 |
| 20.05.2014 04:00 - 05:00 | 0 | 0 | 0 | 0 |
| 20.05.2014 05:00 - 06:00 | 0 | 0 | 0 | 0 |
| 20.05.2014 06:00 - 07:00 | 0 | 0 | 0 | 0 |
| 20.05.2014 07:00 - 08:00 | 0 | 0 | 0 | 0 |
| 20.05.2014 08:00 - 09:00 | 0 | 0 | 0 | 0 |
| 20.05.2014 09:00 - 10:00 | 0 | 0 | 0 | 0 |
| 20.05.2014 10:00 - 11:00 | 0 | 0 | 0 | 0 |
| 20.05.2014 11:00 - 12:00 | 0 | 0 | 0 | 0 |
| 20.05.2014 12:00 - 13:00 | 0 | 0 | 0 | 0 |
| 20.05.2014 13:00 - 14:00 | 0 | 0 | 0 | 0 |
| 20.05.2014 14:00 - 15:00 | 0 | 0 | 0 | 0 |
| 20.05.2014 15:00 - 16:00 | 0 | 0 | 0 | 0 |
| 20.05.2014 16:00 - 17:00 | 0 | 0 | 0 | 0 |
| 20.05.2014 17:00 - 18:00 | 0 | 0 | 0 | 0 |
| 20.05.2014 18:00 - 19:00 | 0 | 0 | 0 | 0 |
| 20.05.2014 19:00 - 20:00 | 0 | 0 | 0 | 0 |
| 20.05.2014 20:00 - 21:00 | 0 | 0 | 0 | 0 |
| 20.05.2014 21:00 - 22:00 | 0 | 0 | 0 | 0 |
| 20.05.2014 22:00 - 23:00 | 0 | 0 | 0 | 0 |
| 20.05.2014 23:00 - 24:00 | 0 | 0 | 0 | 0 |
| 21.05.2014 00:00 - 01:00 | 0 | 0 | 0 | 0 |
| 21.05.2014 01:00 - 02:00 | 0 | 0 | 0 | 0 |
| 21.05.2014 02:00 - 03:00 | 0 | 0 | 0 | 0 |
| 21.05.2014 03:00 - 04:00 | 0 | 0 | 0 | 0 |
| 21.05.2014 04:00 - 05:00 | 0 | 0 | 0 | 0 |
| 21.05.2014 05:00 - 06:00 | 0 | 0 | 0 | 0 |
| 21.05.2014 06:00 - 07:00 | 0 | 0 | 0 | 0 |
| 21.05.2014 07:00 - 08:00 | 0 | 0 | 0 | 0 |
| 21.05.2014 08:00 - 09:00 | 0 | 0 | 0 | 0 |
| 21.05.2014 09:00 - 10:00 | 0 | 0 | 0 | 0 |
| 21.05.2014 10:00 - 11:00 | 0 | 0 | 0 | 0 |
| 21.05.2014 11:00 - 12:00 | 0 | 0 | 0 | 0 |
| 21.05.2014 12:00 - 13:00 | 0 | 0 | 0 | 0 |
| 21.05.2014 13:00 - 14:00 | 0 | 0 | 0 | 0 |
| 21.05.2014 14:00 - 15:00 | 0 | 0 | 0 | 0 |
| 21.05.2014 15:00 - 16:00 | 0 | 0 | 0 | 0 |
| 21.05.2014 16:00 - 17:00 | 0 | 0 | 0 | 0 |
| 21.05.2014 17:00 - 18:00 | 0 | 0 | 0 | 0 |
| 21.05.2014 18:00 - 19:00 | 0 | 0 | 0 | 0 |
| 21.05.2014 19:00 - 20:00 | 0 | -300 | 0 | 0 |
| 21.05.2014 20:00 - 21:00 | 0 | -300 | 0 | 0 |
| 21.05.2014 21:00 - 22:00 | 0 | -300 | 0 | 0 |
| 21.05.2014 22:00 - 23:00 | 0 | -300 | 0 | 0 |
| 21.05.2014 23:00 - 24:00 | 0 | -300 | 0 | 0 |
| 22.05.2014 00:00 - 01:00 | 0 | -300 | 0 | 0 |
| 22.05.2014 01:00 - 02:00 | 0 | -300 | 0 | 0 |
| 22.05.2014 02:00 - 03:00 | 0 | -300 | 0 | 0 |
| 22.05.2014 03:00 - 04:00 | 0 | -300 | 0 | 0 |
| 22.05.2014 04:00 - 05:00 | 0 | -300 | 0 | 0 |
| 22.05.2014 05:00 - 06:00 | 0 | -300 | 0 | 0 |
| 22.05.2014 06:00 - 07:00 | 0 | 0 | 0 | 0 |
| 22.05.2014 07:00 - 08:00 | 0 | 0 | 0 | 0 |
| 22.05.2014 08:00 - 09:00 | 0 | 0 | 0 | 0 |
| 22.05.2014 09:00 - 10:00 | 0 | 0 | 0 | 0 |
| 22.05.2014 10:00 - 11:00 | 0 | 0 | 0 | 0 |
| 22.05.2014 11:00 - 12:00 | 0 | 0 | 0 | 0 |
| 22.05.2014 12:00 - 13:00 | 0 | 0 | 0 | 0 |
| 22.05.2014 13:00 - 14:00 | 0 | 0 | 0 | 0 |
| 22.05.2014 14:00 - 15:00 | 0 | 0 | 0 | 0 |
| 22.05.2014 15:00 - 16:00 | 0 | 0 | 0 | 0 |
| 22.05.2014 16:00 - 17:00 | 0 | 0 | 0 | 0 |
| 22.05.2014 17:00 - 18:00 | 0 | 0 | 0 | 0 |
| 22.05.2014 18:00 - 19:00 | 0 | 0 | 0 | 0 |
| 22.05.2014 19:00 - 20:00 | 0 | 0 | 0 | 0 |
| 22.05.2014 20:00 - 21:00 | 0 | 0 | 0 | 0 |
| 22.05.2014 21:00 - 22:00 | 0 | 0 | 0 | 0 |
| 22.05.2014 22:00 - 23:00 | 0 | 0 | 0 | 0 |
| 22.05.2014 23:00 - 24:00 | 0 | 0 | 0 | 0 |
| 23.05.2014 00:00 - 01:00 | 0 | 0 | 0 | 0 |
| 23.05.2014 01:00 - 02:00 | 0 | 0 | 0 | 0 |
| 23.05.2014 02:00 - 03:00 | 0 | 0 | 0 | 0 |
| 23.05.2014 03:00 - 04:00 | 0 | 0 | 0 | 0 |
| 23.05.2014 04:00 - 05:00 | 0 | -450 | 0 | 0 |
| 23.05.2014 05:00 - 06:00 | 0 | -750 | 0 | 0 |
| 23.05.2014 06:00 - 07:00 | 0 | 0 | 0 | 0 |
| 23.05.2014 07:00 - 08:00 | 0 | 0 | 0 | 0 |
| 23.05.2014 08:00 - 09:00 | 0 | 0 | 0 | 0 |
| 23.05.2014 09:00 - 10:00 | 0 | 0 | 0 | 0 |
| 23.05.2014 10:00 - 11:00 | 0 | 0 | 0 | 0 |
| 23.05.2014 11:00 - 12:00 | 0 | 0 | 0 | 0 |
| 23.05.2014 12:00 - 13:00 | 0 | 0 | 0 | 0 |
| 23.05.2014 13:00 - 14:00 | 0 | 0 | 0 | 0 |
| 23.05.2014 14:00 - 15:00 | 0 | 0 | 0 | 0 |
| 23.05.2014 15:00 - 16:00 | 0 | 0 | 0 | 0 |
| 23.05.2014 16:00 - 17:00 | 0 | 0 | 0 | 0 |
| 23.05.2014 17:00 - 18:00 | 0 | 0 | 0 | 0 |
| 23.05.2014 18:00 - 19:00 | 0 | 0 | 0 | 0 |
| 23.05.2014 19:00 - 20:00 | 0 | 0 | 0 | 0 |
| 23.05.2014 20:00 - 21:00 | 0 | 0 | 0 | 0 |
| 23.05.2014 21:00 - 22:00 | 0 | 0 | 0 | 0 |
| 23.05.2014 22:00 - 23:00 | 0 | 0 | 0 | 0 |
| 23.05.2014 23:00 - 24:00 | 0 | 0 | 0 | 0 |
| 24.05.2014 00:00 - 01:00 | 0 | 0 | 0 | 0 |
| 24.05.2014 01:00 - 02:00 | 0 | 0 | 0 | 0 |
| 24.05.2014 02:00 - 03:00 | 0 | -260 | 0 | 0 |
| 24.05.2014 03:00 - 04:00 | 0 | -500 | 0 | 0 |
| 24.05.2014 04:00 - 05:00 | 0 | -500 | 0 | 0 |
| 24.05.2014 05:00 - 06:00 | 0 | -500 | 0 | 0 |
| 24.05.2014 06:00 - 07:00 | 0 | 0 | 0 | 0 |
| 24.05.2014 07:00 - 08:00 | 0 | 0 | 0 | 0 |
| 24.05.2014 08:00 - 09:00 | 0 | 0 | 0 | 0 |
| 24.05.2014 09:00 - 10:00 | 0 | 0 | 0 | 0 |
| 24.05.2014 10:00 - 11:00 | 0 | 0 | 0 | 0 |
| 24.05.2014 11:00 - 12:00 | 0 | 0 | 0 | 0 |
| 24.05.2014 12:00 - 13:00 | 0 | 0 | 0 | 0 |
| 24.05.2014 13:00 - 14:00 | 0 | 0 | 0 | 0 |
| 24.05.2014 14:00 - 15:00 | 0 | 0 | 0 | 0 |
| 24.05.2014 15:00 - 16:00 | 0 | 0 | 0 | 0 |
| 24.05.2014 16:00 - 17:00 | 0 | 0 | 0 | 0 |
| 24.05.2014 17:00 - 18:00 | 0 | 0 | 0 | 0 |
| 24.05.2014 18:00 - 19:00 | 0 | 0 | 0 | 0 |
| 24.05.2014 19:00 - 20:00 | 0 | 0 | 0 | 0 |
| 24.05.2014 20:00 - 21:00 | 0 | 0 | 0 | 0 |
| 24.05.2014 21:00 - 22:00 | 0 | 0 | 0 | 0 |
| 24.05.2014 22:00 - 23:00 | 0 | 0 | 0 | 0 |
| 24.05.2014 23:00 - 24:00 | 0 | 0 | 0 | 0 |
| 25.05.2014 00:00 - 01:00 | 0 | 0 | 0 | 0 |
| 25.05.2014 01:00 - 02:00 | 0 | 0 | 0 | 0 |
| 25.05.2014 02:00 - 03:00 | 0 | 0 | 0 | 0 |
| 25.05.2014 03:00 - 04:00 | 0 | 0 | 0 | 0 |
| 25.05.2014 04:00 - 05:00 | 0 | 0 | 0 | 0 |
| 25.05.2014 05:00 - 06:00 | 0 | 0 | 0 | 0 |
| 25.05.2014 06:00 - 07:00 | 0 | 0 | 0 | 0 |
| 25.05.2014 07:00 - 08:00 | 0 | 0 | 0 | 0 |
| 25.05.2014 08:00 - 09:00 | 0 | 0 | 0 | 0 |
| 25.05.2014 09:00 - 10:00 | 0 | 0 | 0 | 0 |
| 25.05.2014 10:00 - 11:00 | 0 | 0 | 0 | 0 |
| 25.05.2014 11:00 - 12:00 | 0 | 0 | 0 | 0 |
| 25.05.2014 12:00 - 13:00 | 0 | 0 | 0 | 0 |
| 25.05.2014 13:00 - 14:00 | 0 | 0 | 0 | 0 |
| 25.05.2014 14:00 - 15:00 | 0 | 0 | 0 | 0 |
| 25.05.2014 15:00 - 16:00 | 0 | 0 | 0 | 0 |
| 25.05.2014 16:00 - 17:00 | 0 | 0 | 0 | 0 |
| 25.05.2014 17:00 - 18:00 | 0 | 0 | 0 | 0 |
| 25.05.2014 18:00 - 19:00 | 0 | 0 | 0 | 0 |
| 25.05.2014 19:00 - 20:00 | 0 | 0 | 0 | 0 |
| 25.05.2014 20:00 - 21:00 | 0 | 0 | 0 | 0 |
| 25.05.2014 21:00 - 22:00 | 0 | 0 | 0 | 0 |
| 25.05.2014 22:00 - 23:00 | 0 | 0 | 0 | 0 |
| 25.05.2014 23:00 - 24:00 | 0 | 0 | 0 | 0 |
| 26.05.2014 00:00 - 01:00 | 0 | 0 | 0 | 0 |
| 26.05.2014 01:00 - 02:00 | 0 | 0 | 0 | 0 |
| 26.05.2014 02:00 - 03:00 | 0 | 0 | 0 | 0 |
| 26.05.2014 03:00 - 04:00 | 0 | 0 | 0 | 0 |
| 26.05.2014 04:00 - 05:00 | 0 | 0 | 0 | 0 |
| 26.05.2014 05:00 - 06:00 | 0 | 0 | 0 | 0 |
| 26.05.2014 06:00 - 07:00 | 0 | 0 | 0 | 0 |
| 26.05.2014 07:00 - 08:00 | 0 | 0 | 0 | 0 |
| 26.05.2014 08:00 - 09:00 | 0 | 0 | 0 | 0 |
| 26.05.2014 09:00 - 10:00 | 0 | 0 | 0 | 0 |
| 26.05.2014 10:00 - 11:00 | 0 | 0 | 0 | 0 |
| 26.05.2014 11:00 - 12:00 | 0 | 0 | 0 | 0 |
| 26.05.2014 12:00 - 13:00 | 0 | 0 | 0 | 0 |
| 26.05.2014 13:00 - 14:00 | 0 | 0 | 0 | 0 |
| 26.05.2014 14:00 - 15:00 | 0 | 0 | 0 | 0 |
| 26.05.2014 15:00 - 16:00 | 0 | 0 | 0 | 0 |
| 26.05.2014 16:00 - 17:00 | 0 | 0 | 0 | 0 |
| 26.05.2014 17:00 - 18:00 | 0 | 0 | 0 | 0 |
| 26.05.2014 18:00 - 19:00 | 0 | -300 | 0 | 0 |
| 26.05.2014 19:00 - 20:00 | 0 | -300 | 0 | 0 |
| 26.05.2014 20:00 - 21:00 | 0 | -300 | 0 | 0 |
| 26.05.2014 21:00 - 22:00 | 0 | -300 | 0 | 0 |
| 26.05.2014 22:00 - 23:00 | 0 | -300 | 0 | 0 |
| 26.05.2014 23:00 - 24:00 | 0 | -300 | 0 | 0 |
| 27.05.2014 00:00 - 01:00 | 0 | -300 | 0 | 0 |
| 27.05.2014 01:00 - 02:00 | 0 | -600 | 0 | 0 |
| 27.05.2014 02:00 - 03:00 | 0 | -600 | 0 | 0 |
| 27.05.2014 03:00 - 04:00 | 0 | -600 | 0 | 0 |
| 27.05.2014 04:00 - 05:00 | 0 | -600 | 0 | 0 |
| 27.05.2014 05:00 - 06:00 | 0 | -600 | 0 | 0 |
| 27.05.2014 06:00 - 07:00 | 0 | 0 | 0 | 0 |
| 27.05.2014 07:00 - 08:00 | 0 | 0 | 0 | 0 |
| 27.05.2014 08:00 - 09:00 | 0 | 0 | 0 | 0 |
| 27.05.2014 09:00 - 10:00 | 0 | 0 | 0 | 0 |
| 27.05.2014 10:00 - 11:00 | 0 | 0 | 0 | 0 |
| 27.05.2014 11:00 - 12:00 | 0 | 0 | 0 | 0 |
| 27.05.2014 12:00 - 13:00 | 0 | 0 | 0 | 0 |
| 27.05.2014 13:00 - 14:00 | 0 | 0 | 0 | 0 |
| 27.05.2014 14:00 - 15:00 | 0 | 0 | 0 | 0 |
| 27.05.2014 15:00 - 16:00 | 0 | 0 | 0 | 0 |
| 27.05.2014 16:00 - 17:00 | 0 | 0 | 0 | 0 |
| 27.05.2014 17:00 - 18:00 | 0 | 0 | 0 | 0 |
| 27.05.2014 18:00 - 19:00 | 0 | 0 | 0 | 0 |
| 27.05.2014 19:00 - 20:00 | 0 | 0 | 0 | 0 |
| 27.05.2014 20:00 - 21:00 | 0 | 0 | 0 | 0 |
| 27.05.2014 21:00 - 22:00 | 0 | 0 | 0 | 0 |
| 27.05.2014 22:00 - 23:00 | 0 | 0 | 0 | 0 |
| 27.05.2014 23:00 - 24:00 | 0 | 0 | 0 | 0 |
| 28.05.2014 00:00 - 01:00 | 0 | 0 | 0 | 0 |
| 28.05.2014 01:00 - 02:00 | 0 | 0 | 0 | 0 |
| 28.05.2014 02:00 - 03:00 | 0 | 0 | 0 | 0 |
| 28.05.2014 03:00 - 04:00 | 0 | 0 | 0 | 0 |
| 28.05.2014 04:00 - 05:00 | 0 | 0 | 0 | 0 |
| 28.05.2014 05:00 - 06:00 | 0 | 0 | 0 | 0 |
| 28.05.2014 06:00 - 07:00 | 0 | 0 | 0 | 0 |
| 28.05.2014 07:00 - 08:00 | 0 | 0 | 0 | 0 |
| 28.05.2014 08:00 - 09:00 | 0 | 0 | 0 | 0 |
| 28.05.2014 09:00 - 10:00 | 0 | 0 | 0 | 0 |
| 28.05.2014 10:00 - 11:00 | 0 | 0 | 0 | 0 |
| 28.05.2014 11:00 - 12:00 | 0 | 0 | 0 | 0 |
| 28.05.2014 12:00 - 13:00 | 0 | 0 | 0 | 0 |
| 28.05.2014 13:00 - 14:00 | 0 | 0 | 0 | 0 |
| 28.05.2014 14:00 - 15:00 | 0 | 0 | 0 | 0 |
| 28.05.2014 15:00 - 16:00 | 0 | 0 | 0 | 0 |
| 28.05.2014 16:00 - 17:00 | 0 | 0 | 0 | 0 |
| 28.05.2014 17:00 - 18:00 | 0 | 0 | 0 | 0 |
| 28.05.2014 18:00 - 19:00 | 0 | 0 | 0 | 0 |
| 28.05.2014 19:00 - 20:00 | 0 | 0 | 0 | 0 |
| 28.05.2014 20:00 - 21:00 | 0 | 0 | 0 | 0 |
| 28.05.2014 21:00 - 22:00 | 0 | 0 | 0 | 0 |
| 28.05.2014 22:00 - 23:00 | 0 | 0 | 0 | 0 |
| 28.05.2014 23:00 - 24:00 | 0 | 0 | 0 | 0 |
| 29.05.2014 00:00 - 01:00 | 0 | 0 | 0 | 0 |
| 29.05.2014 01:00 - 02:00 | 0 | 0 | 0 | 0 |
| 29.05.2014 02:00 - 03:00 | 0 | 0 | 0 | 0 |
| 29.05.2014 03:00 - 04:00 | 0 | 0 | 0 | 0 |
| 29.05.2014 04:00 - 05:00 | 0 | 0 | 0 | 0 |
| 29.05.2014 05:00 - 06:00 | 0 | 0 | 0 | 0 |
| 29.05.2014 06:00 - 07:00 | 0 | 0 | 0 | 0 |
| 29.05.2014 07:00 - 08:00 | 0 | 0 | 0 | 0 |
| 29.05.2014 08:00 - 09:00 | 0 | 0 | 0 | 0 |
| 29.05.2014 09:00 - 10:00 | 0 | 0 | 0 | 0 |
| 29.05.2014 10:00 - 11:00 | 0 | 0 | 0 | 0 |
| 29.05.2014 11:00 - 12:00 | 0 | 0 | 0 | 0 |
| 29.05.2014 12:00 - 13:00 | 0 | 0 | 0 | 0 |
| 29.05.2014 13:00 - 14:00 | 0 | 0 | 0 | 0 |
| 29.05.2014 14:00 - 15:00 | 0 | 0 | 0 | 0 |
| 29.05.2014 15:00 - 16:00 | 0 | 0 | 0 | 0 |
| 29.05.2014 16:00 - 17:00 | 0 | 0 | 0 | 0 |
| 29.05.2014 17:00 - 18:00 | 0 | 0 | 0 | 0 |
| 29.05.2014 18:00 - 19:00 | 0 | 0 | 0 | 0 |
| 29.05.2014 19:00 - 20:00 | 0 | 0 | 0 | 0 |
| 29.05.2014 20:00 - 21:00 | 700 | 0 | 0 | 0 |
| 29.05.2014 21:00 - 22:00 | 700 | 0 | 0 | 0 |
| 29.05.2014 22:00 - 23:00 | 700 | 0 | 0 | 0 |
| 29.05.2014 23:00 - 24:00 | 700 | 0 | 0 | 0 |
| 30.05.2014 00:00 - 01:00 | 700 | 0 | 0 | 0 |
| 30.05.2014 01:00 - 02:00 | 700 | 0 | 0 | 0 |
| 30.05.2014 02:00 - 03:00 | 700 | 0 | 0 | 0 |
| 30.05.2014 03:00 - 04:00 | 700 | 0 | 0 | 0 |
| 30.05.2014 04:00 - 05:00 | 700 | 0 | 0 | 0 |
| 30.05.2014 05:00 - 06:00 | 700 | 0 | 0 | 0 |
| 30.05.2014 06:00 - 07:00 | 0 | 0 | 0 | 0 |
| 30.05.2014 07:00 - 08:00 | 0 | 0 | 0 | 0 |
| 30.05.2014 08:00 - 09:00 | 0 | 0 | 0 | 0 |
| 30.05.2014 09:00 - 10:00 | 0 | 0 | 0 | 0 |
| 30.05.2014 10:00 - 11:00 | 0 | 0 | 0 | 0 |
| 30.05.2014 11:00 - 12:00 | 0 | 0 | 0 | 0 |
| 30.05.2014 12:00 - 13:00 | 0 | 0 | 0 | 0 |
| 30.05.2014 13:00 - 14:00 | 0 | 0 | 0 | 0 |
| 30.05.2014 14:00 - 15:00 | 0 | 0 | 0 | 0 |
| 30.05.2014 15:00 - 16:00 | 0 | 0 | 0 | 0 |
| 30.05.2014 16:00 - 17:00 | 0 | 0 | 0 | 0 |
| 30.05.2014 17:00 - 18:00 | 0 | 0 | 0 | 0 |
| 30.05.2014 18:00 - 19:00 | 0 | 0 | 0 | 0 |
| 30.05.2014 19:00 - 20:00 | 0 | 0 | 0 | 0 |
| 30.05.2014 20:00 - 21:00 | 0 | 0 | 0 | 0 |
| 30.05.2014 21:00 - 22:00 | 0 | 0 | 0 | 0 |
| 30.05.2014 22:00 - 23:00 | 0 | 0 | 0 | 0 |
| 30.05.2014 23:00 - 24:00 | 0 | 0 | 0 | 0 |
| 31.05.2014 00:00 - 01:00 | 0 | 0 | 0 | 0 |
| 31.05.2014 01:00 - 02:00 | 0 | 0 | 0 | 0 |
| 31.05.2014 02:00 - 03:00 | 0 | 0 | 0 | 0 |
| 31.05.2014 03:00 - 04:00 | 300 | 0 | 0 | 0 |
| 31.05.2014 04:00 - 05:00 | 300 | 0 | 0 | 0 |
| 31.05.2014 05:00 - 06:00 | 300 | 0 | 0 | 0 |